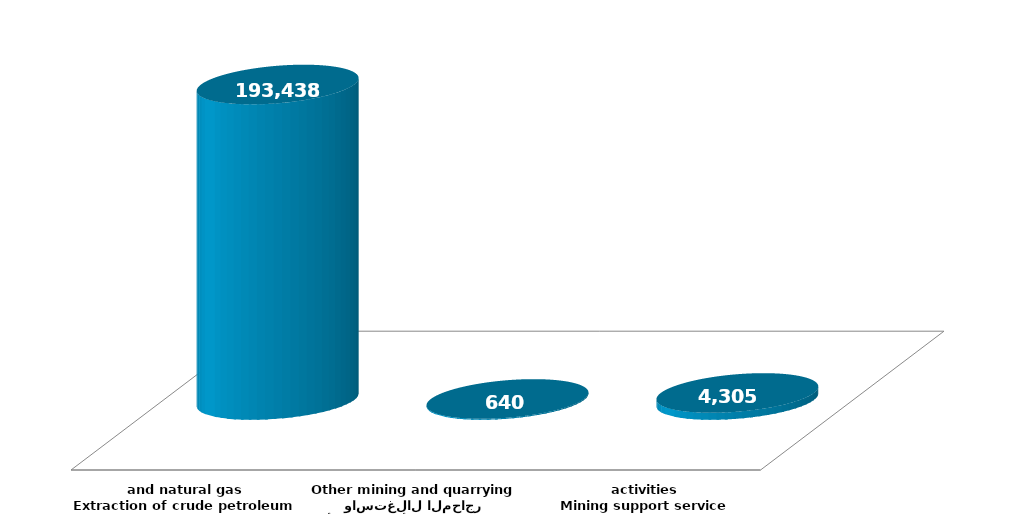
| Category | Series 1 |
|---|---|
| استخراج النفط الخام والغاز الطبيعي
Extraction of crude petroleum and natural gas | 193437699 |
| الأنشطة الأخرى للتعدين واستغلال المحاجر
Other mining and quarrying | 639681 |
| انشطة خدمات دعم التعدين
Mining support service activities | 4305381 |